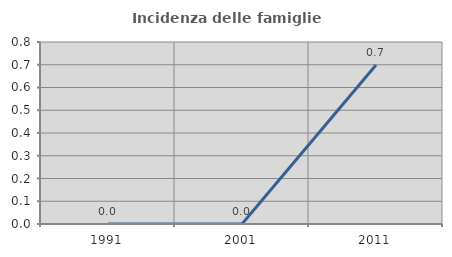
| Category | Incidenza delle famiglie numerose |
|---|---|
| 1991.0 | 0 |
| 2001.0 | 0 |
| 2011.0 | 0.699 |